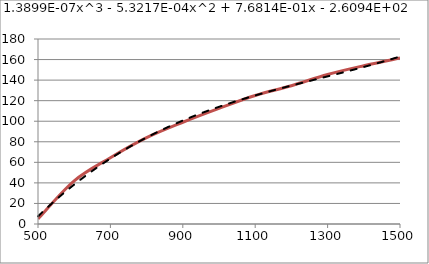
| Category | Series 0 |
|---|---|
| 500.0 | 5 |
| 600.0 | 42 |
| 700.0 | 64.5 |
| 800.0 | 84 |
| 900.0 | 99 |
| 1000.0 | 112.5 |
| 1100.0 | 125 |
| 1200.0 | 134.5 |
| 1300.0 | 145.5 |
| 1400.0 | 154 |
| 1500.0 | 161.5 |